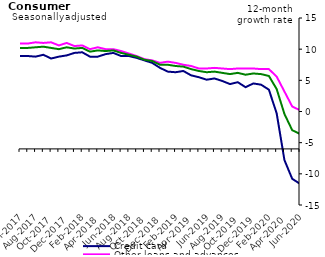
| Category | Credit card | Other loans and advances | Total |
|---|---|---|---|
| Jun-2017 | 8.9 | 10.9 | 10.2 |
| Jul-2017 | 8.9 | 10.9 | 10.2 |
| Aug-2017 | 8.8 | 11.1 | 10.3 |
| Sep-2017 | 9.1 | 11 | 10.4 |
| Oct-2017 | 8.5 | 11.1 | 10.2 |
| Nov-2017 | 8.8 | 10.6 | 10 |
| Dec-2017 | 9 | 11 | 10.3 |
| Jan-2018 | 9.4 | 10.5 | 10.1 |
| Feb-2018 | 9.5 | 10.6 | 10.2 |
| Mar-2018 | 8.8 | 10 | 9.6 |
| Apr-2018 | 8.8 | 10.3 | 9.8 |
| May-2018 | 9.2 | 10 | 9.7 |
| Jun-2018 | 9.4 | 10 | 9.8 |
| Jul-2018 | 8.9 | 9.7 | 9.4 |
| Aug-2018 | 8.9 | 9.3 | 9.1 |
| Sep-2018 | 8.6 | 8.9 | 8.8 |
| Oct-2018 | 8.2 | 8.4 | 8.3 |
| Nov-2018 | 7.8 | 8.2 | 8.1 |
| Dec-2018 | 7 | 7.8 | 7.5 |
| Jan-2019 | 6.4 | 8 | 7.5 |
| Feb-2019 | 6.3 | 7.8 | 7.3 |
| Mar-2019 | 6.5 | 7.5 | 7.2 |
| Apr-2019 | 5.8 | 7.3 | 6.8 |
| May-2019 | 5.5 | 6.9 | 6.5 |
| Jun-2019 | 5.1 | 6.9 | 6.3 |
| Jul-2019 | 5.3 | 7 | 6.4 |
| Aug-2019 | 4.9 | 6.9 | 6.2 |
| Sep-2019 | 4.4 | 6.8 | 6 |
| Oct-2019 | 4.7 | 6.9 | 6.2 |
| Nov-2019 | 3.9 | 6.9 | 5.9 |
| Dec-2019 | 4.5 | 6.9 | 6.1 |
| Jan-2020 | 4.3 | 6.8 | 6 |
| Feb-2020 | 3.5 | 6.8 | 5.7 |
| Mar-2020 | -0.3 | 5.6 | 3.6 |
| Apr-2020 | -7.8 | 3.2 | -0.4 |
| May-2020 | -10.8 | 0.8 | -3 |
| Jun-2020 | -11.6 | 0.2 | -3.6 |